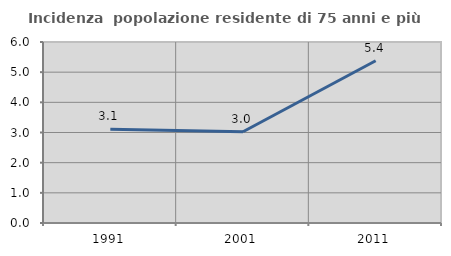
| Category | Incidenza  popolazione residente di 75 anni e più |
|---|---|
| 1991.0 | 3.104 |
| 2001.0 | 3.024 |
| 2011.0 | 5.379 |